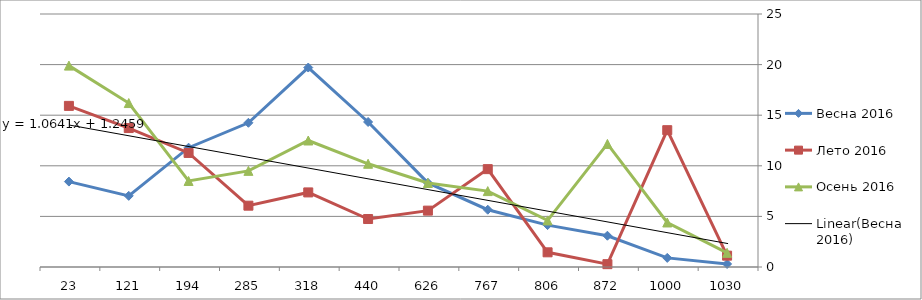
| Category | Весна 2016 | Лето 2016 | Осень 2016 |
|---|---|---|---|
| 1030.0 | 0.3 | 1.12 | 1.4 |
| 1000.0 | 0.9 | 13.52 | 4.4 |
| 872.0 | 3.09 | 0.28 | 12.16 |
| 806.0 | 4.14 | 1.45 | 4.6 |
| 767.0 | 5.66 | 9.67 | 7.5 |
| 626.0 | 8.31 | 5.57 | 8.3 |
| 440.0 | 14.33 | 4.74 | 10.2 |
| 318.0 | 19.71 | 7.37 | 12.5 |
| 285.0 | 14.25 | 6.06 | 9.5 |
| 194.0 | 11.79 | 11.27 | 8.5 |
| 121.0 | 7.03 | 13.73 | 16.2 |
| 23.0 | 8.44 | 15.92 | 19.9 |